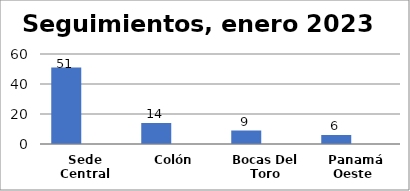
| Category | Series 0 | Series 1 |
|---|---|---|
| Sede Central | 51 |  |
| Colón | 14 |  |
| Bocas Del Toro | 9 |  |
| Panamá Oeste  | 6 |  |